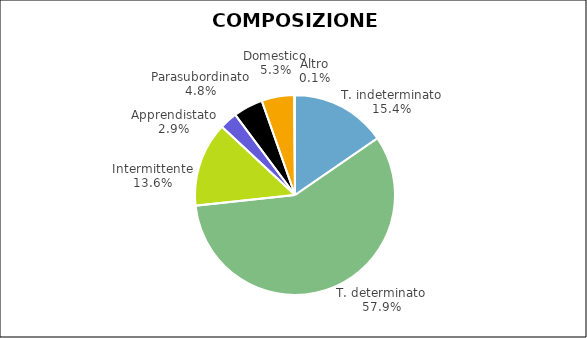
| Category | Series 0 |
|---|---|
| T. indeterminato | 14009 |
| T. determinato | 52660 |
| Intermittente | 12408 |
| Apprendistato | 2610 |
| Parasubordinato | 4349 |
| Domestico | 4784 |
| Altro | 130 |